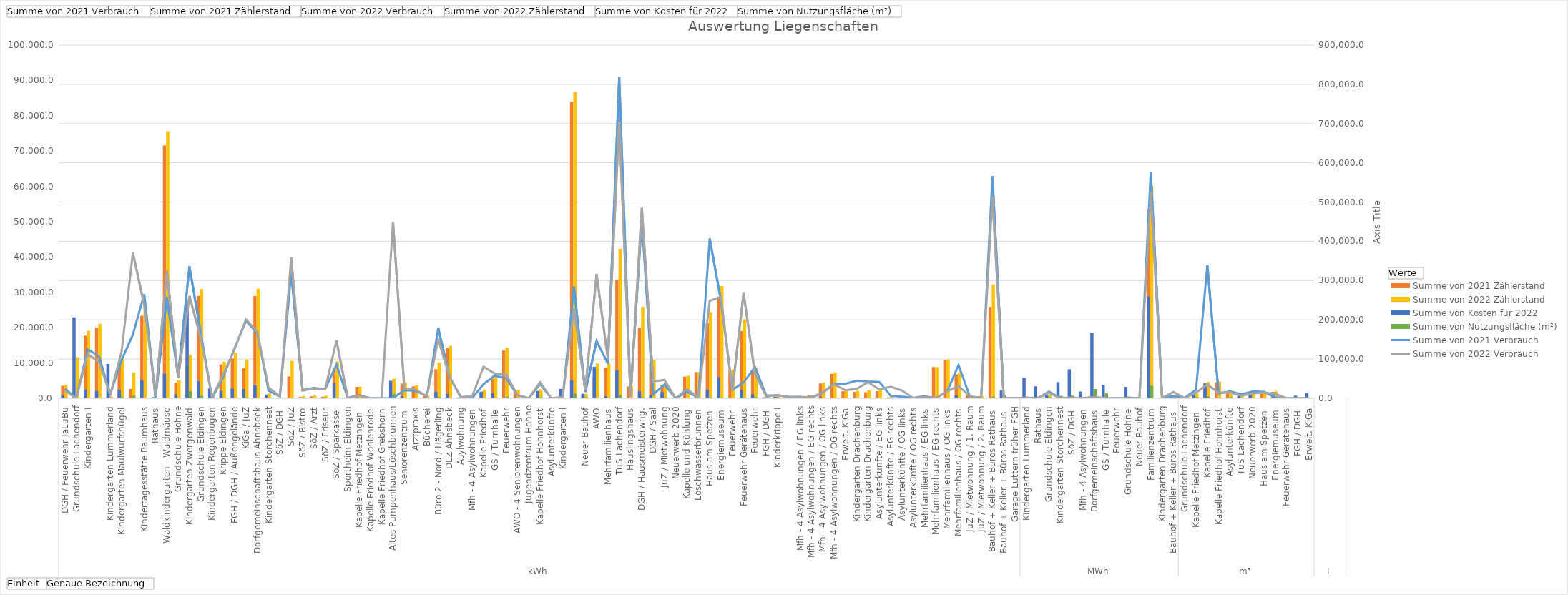
| Category | Summe von 2021 Zählerstand | Summe von 2022 Zählerstand |
|---|---|---|
| 0 | 31896 | 34033 |
| 1 | 0 | 104470 |
| 2 | 159709 | 172250 |
| 3 | 179724 | 190015 |
| 4 | 2949.6 | 3956.169 |
| 5 | 86218 | 99457 |
| 6 | 24123.513 | 65315.908 |
| 7 | 210537 | 237014 |
| 8 | 284 | 981 |
| 9 | 644245 | 680370 |
| 10 | 39803 | 45686 |
| 11 | 82835 | 111812 |
| 12 | 261011 | 278104 |
| 13 | 0 | 331.2 |
| 14 | 86271 | 93074 |
| 15 | 101500 | 115459 |
| 16 | 76336 | 98705 |
| 17 | 260356 | 279134 |
| 18 | 9744 | 12776 |
| 19 | 873 | 1459 |
| 20 | 55660 | 95463 |
| 21 | 3582 | 5746 |
| 22 | 4808 | 7566 |
| 23 | 3850 | 6379 |
| 24 | 77261 | 93667 |
| 25 | 104 | 105 |
| 26 | 28862 | 29634 |
| 27 | 986 | 1021 |
| 28 | 0 | 3 |
| 29 | 0 | 50000 |
| 30 | 37284 | 40008 |
| 31 | 30282 | 32704 |
| 32 | 5594 | 6137 |
| 33 | 74082 | 90924 |
| 34 | 127673 | 133701 |
| 35 | 1459 | 1799 |
| 36 | 98 | 712 |
| 37 | 13070 | 22038 |
| 38 | 49389 | 56345 |
| 39 | 121807 | 128579 |
| 40 | 20353 | 21238 |
| 41 | 27 | 42 |
| 42 | 18081 | 22600 |
| 43 | 0 | 0 |
| 44 | 30.4 | 367.6 |
| 45 | 755025 | 780559 |
| 46 | 9023 | 11365 |
| 47 | 53678.55 | 88832 |
| 48 | 77820 | 88882 |
| 49 | 302530.211 | 380863.998 |
| 50 | 29988 | 30428 |
| 51 | 179431 | 233326 |
| 52 | 92140 | 96977 |
| 53 | 33973 | 39144 |
| 54 | 41 | 45 |
| 55 | 55151 | 57763 |
| 56 | 66666 | 66812 |
| 57 | 191907 | 219513 |
| 58 | 257106 | 285827 |
| 59 | 71017 | 73175 |
| 60 | 171684 | 201485 |
| 61 | 70366 | 77327 |
| 62 | 2392 | 2843 |
| 63 | 3720 | 4661 |
| 64 | 1539 | 1794 |
| 65 | 1880 | 2256 |
| 66 | 8162 | 8472 |
| 67 | 37648 | 39259 |
| 68 | 62123 | 66081 |
| 69 | 18054 | 20337 |
| 70 | 16303 | 18976 |
| 71 | 15290 | 19842 |
| 72 | 18254 | 20743 |
| 73 | 2478 | 5731 |
| 74 | 2099 | 4328 |
| 75 | 804 | 876 |
| 76 | 1769 | 2134 |
| 77 | 79601 | 79649 |
| 78 | 96859 | 98828 |
| 79 | 60785 | 64290 |
| 80 | 7604 | 8169 |
| 81 | 5239 | 5239 |
| 82 | 232794 | 289987 |
| 83 | 263.222 | 317.581 |
| 84 | 831.789 | 862 |
| 85 | 275.676 | 349.15 |
| 86 | 245.658 | 278.84 |
| 87 | 7607 | 9161 |
| 88 | 45.235 | 45.277 |
| 89 | 685.79 | 813.79 |
| 90 | 148 | 176.2 |
| 91 | 1611.26 | 1903.18 |
| 92 | 528.992 | 598.522 |
| 93 | 0 | 11.276 |
| 94 | 295.152 | 348.62 |
| 95 | 939.994 | 1007.847 |
| 96 | 482445 | 540994 |
| 97 | 1378 | 1511 |
| 98 | 2638 | 4430 |
| 99 | 756 | 801 |
| 100 | 10928 | 12530 |
| 101 | 37611 | 41524 |
| 102 | 40935 | 42501.09 |
| 103 | 16303 | 17988 |
| 104 | 7762 | 8459 |
| 105 | 10338 | 11762 |
| 106 | 11469 | 13089 |
| 107 | 16369 | 17628 |
| 108 | 961 | 872 |
| 109 | 862 | 872 |
| 110 | 2203 | 1630 |